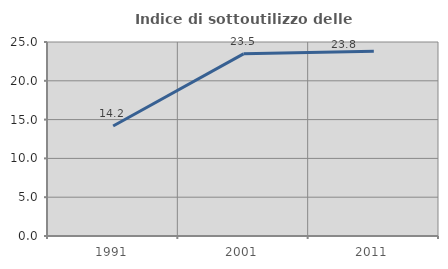
| Category | Indice di sottoutilizzo delle abitazioni  |
|---|---|
| 1991.0 | 14.17 |
| 2001.0 | 23.477 |
| 2011.0 | 23.81 |